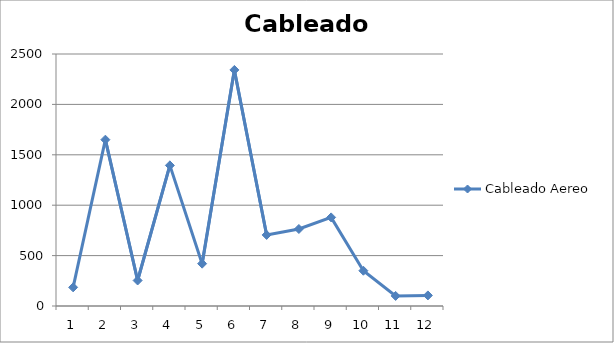
| Category | Cableado Aereo  |
|---|---|
| 0 | 185 |
| 1 | 1650 |
| 2 | 253 |
| 3 | 1395 |
| 4 | 420 |
| 5 | 2342 |
| 6 | 705 |
| 7 | 764 |
| 8 | 879 |
| 9 | 350 |
| 10 | 100 |
| 11 | 105 |